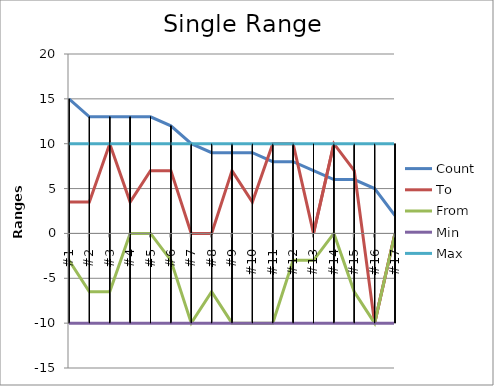
| Category | Count | To | From | Min | Max |
|---|---|---|---|---|---|
| #1 | 15 | 3.5 | -3 | -10 | 10 |
| #2 | 13 | 3.5 | -6.5 | -10 | 10 |
| #3 | 13 | 10 | -6.5 | -10 | 10 |
| #4 | 13 | 3.5 | 0 | -10 | 10 |
| #5 | 13 | 7 | 0 | -10 | 10 |
| #6 | 12 | 7 | -3 | -10 | 10 |
| #7 | 10 | 0 | -10 | -10 | 10 |
| #8 | 9 | 0 | -6.5 | -10 | 10 |
| #9 | 9 | 7 | -10 | -10 | 10 |
| #10 | 9 | 3.5 | -10 | -10 | 10 |
| #11 | 8 | 10 | -10 | -10 | 10 |
| #12 | 8 | 10 | -3 | -10 | 10 |
| #13 | 7 | 0 | -3 | -10 | 10 |
| #14 | 6 | 10 | 0 | -10 | 10 |
| #15 | 6 | 7 | -6.5 | -10 | 10 |
| #16 | 5 | -10 | -10 | -10 | 10 |
| #17 | 2 | 0 | 0 | -10 | 10 |